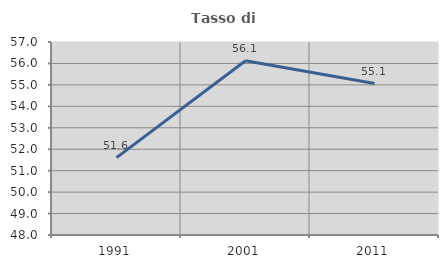
| Category | Tasso di occupazione   |
|---|---|
| 1991.0 | 51.61 |
| 2001.0 | 56.125 |
| 2011.0 | 55.063 |